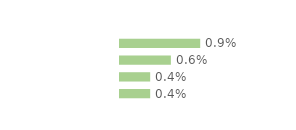
| Category | Series 0 |
|---|---|
| Modeste | 0.009 |
| Médian inférieur | 0.006 |
| Médian supérieur | 0.004 |
| Aisé | 0.004 |